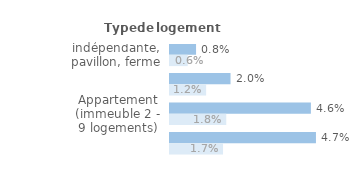
| Category | Series 1 | Series 0 |
|---|---|---|
| Maison indépendante, pavillon, ferme | 0.008 | 0.006 |
| Maison de ville groupée | 0.02 | 0.012 |
| Appartement (immeuble 2 - 9 logements) | 0.046 | 0.018 |
| Appartement (immeuble de 10 logements ou +) | 0.047 | 0.017 |